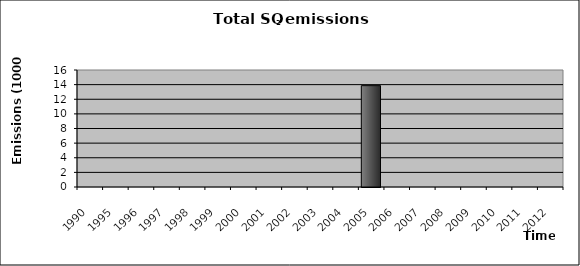
| Category | Series 0 |
|---|---|
| 1990.0 | 0 |
| 1995.0 | 0 |
| 1996.0 | 0 |
| 1997.0 | 0 |
| 1998.0 | 0 |
| 1999.0 | 0 |
| 2000.0 | 0 |
| 2001.0 | 0 |
| 2002.0 | 0 |
| 2003.0 | 0 |
| 2004.0 | 0 |
| 2005.0 | 13.86 |
| 2006.0 | 0 |
| 2007.0 | 0 |
| 2008.0 | 0 |
| 2009.0 | 0 |
| 2010.0 | 0 |
| 2011.0 | 0 |
| 2012.0 | 0 |